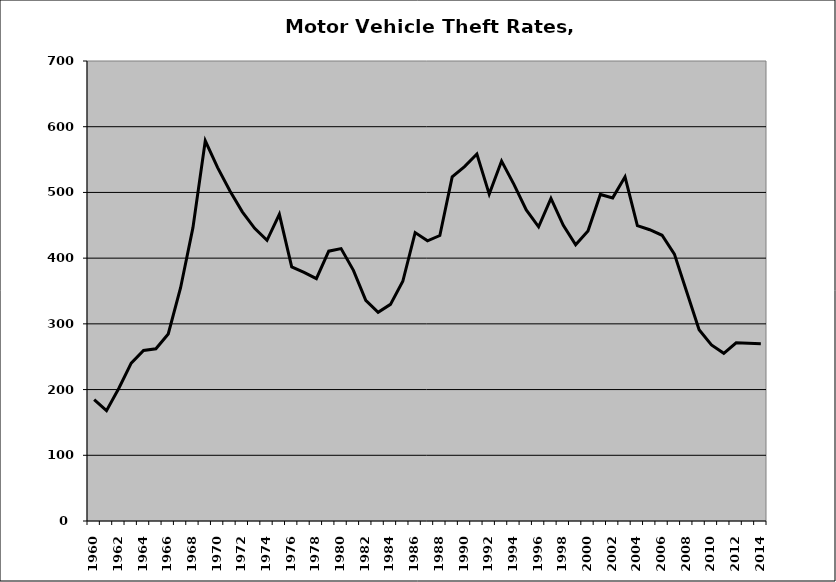
| Category | Motor Vehicle |
|---|---|
| 1960.0 | 184.777 |
| 1961.0 | 167.908 |
| 1962.0 | 202.071 |
| 1963.0 | 240.319 |
| 1964.0 | 259.515 |
| 1965.0 | 262.086 |
| 1966.0 | 284.561 |
| 1967.0 | 355.008 |
| 1968.0 | 446.423 |
| 1969.0 | 578.478 |
| 1970.0 | 537.82 |
| 1971.0 | 502.169 |
| 1972.0 | 470.461 |
| 1973.0 | 445.386 |
| 1974.0 | 427.109 |
| 1975.0 | 466.66 |
| 1976.0 | 386.584 |
| 1977.0 | 378.359 |
| 1978.0 | 368.848 |
| 1979.0 | 410.6 |
| 1980.0 | 414.564 |
| 1981.0 | 381.43 |
| 1982.0 | 335.771 |
| 1983.0 | 317.545 |
| 1984.0 | 329.692 |
| 1985.0 | 364.784 |
| 1986.0 | 438.867 |
| 1987.0 | 426.318 |
| 1988.0 | 434.423 |
| 1989.0 | 523.57 |
| 1990.0 | 539.351 |
| 1991.0 | 558.472 |
| 1992.0 | 497.42 |
| 1993.0 | 547.688 |
| 1994.0 | 512.277 |
| 1995.0 | 473.31 |
| 1996.0 | 447.695 |
| 1997.0 | 490.874 |
| 1998.0 | 449.825 |
| 1999.0 | 420.311 |
| 2000.0 | 441.36 |
| 2001.0 | 496.939 |
| 2002.0 | 491.715 |
| 2003.0 | 523.692 |
| 2004.0 | 449.568 |
| 2005.0 | 443.262 |
| 2006.0 | 434.815 |
| 2007.0 | 406.079 |
| 2008.0 | 348.57 |
| 2009.0 | 291.069 |
| 2010.0 | 268.011 |
| 2011.0 | 255.135 |
| 2012.0 | 271.092 |
| 2013.0 | 270.376 |
| 2014.0 | 269.758 |